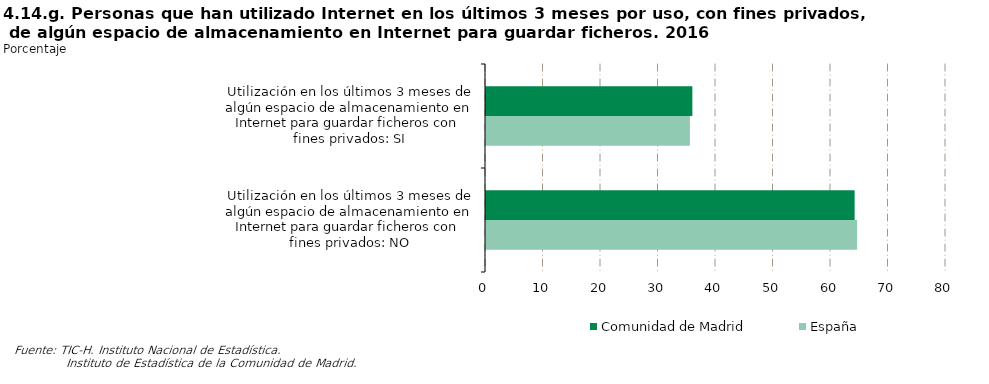
| Category | Comunidad de Madrid | España |
|---|---|---|
| Utilización en los últimos 3 meses de algún espacio de almacenamiento en Internet para guardar ficheros con fines privados: SI | 35.889 | 35.458 |
| Utilización en los últimos 3 meses de algún espacio de almacenamiento en Internet para guardar ficheros con fines privados: NO | 64.111 | 64.542 |